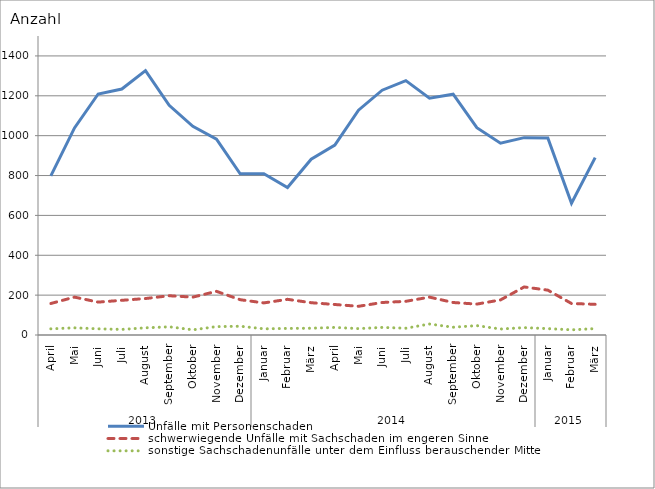
| Category | Unfälle mit Personenschaden | schwerwiegende Unfälle mit Sachschaden im engeren Sinne | sonstige Sachschadenunfälle unter dem Einfluss berauschender Mittel |
|---|---|---|---|
| 0 | 798 | 158 | 31 |
| 1 | 1039 | 190 | 36 |
| 2 | 1209 | 165 | 31 |
| 3 | 1234 | 174 | 28 |
| 4 | 1326 | 183 | 36 |
| 5 | 1152 | 197 | 41 |
| 6 | 1047 | 190 | 26 |
| 7 | 983 | 219 | 42 |
| 8 | 809 | 177 | 44 |
| 9 | 809 | 161 | 31 |
| 10 | 740 | 179 | 33 |
| 11 | 882 | 162 | 34 |
| 12 | 953 | 153 | 38 |
| 13 | 1128 | 144 | 32 |
| 14 | 1228 | 163 | 38 |
| 15 | 1276 | 169 | 34 |
| 16 | 1188 | 190 | 55 |
| 17 | 1208 | 163 | 39 |
| 18 | 1040 | 155 | 47 |
| 19 | 962 | 176 | 30 |
| 20 | 990 | 241 | 37 |
| 21 | 988 | 225 | 32 |
| 22 | 661 | 158 | 26 |
| 23 | 890 | 154 | 32 |